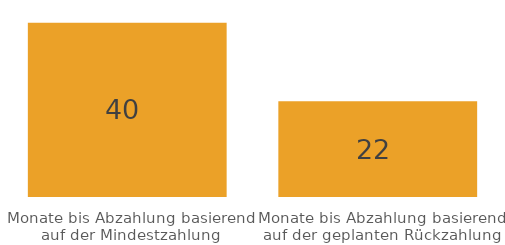
| Category | Series 0 |
|---|---|
| Monate bis Abzahlung basierend auf der Mindestzahlung | 40 |
| Monate bis Abzahlung basierend auf der geplanten Rückzahlung | 22 |